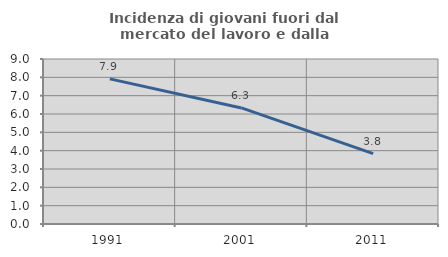
| Category | Incidenza di giovani fuori dal mercato del lavoro e dalla formazione  |
|---|---|
| 1991.0 | 7.917 |
| 2001.0 | 6.33 |
| 2011.0 | 3.84 |